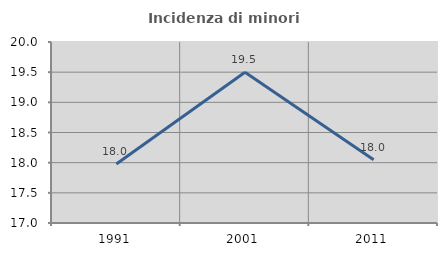
| Category | Incidenza di minori stranieri |
|---|---|
| 1991.0 | 17.977 |
| 2001.0 | 19.498 |
| 2011.0 | 18.049 |